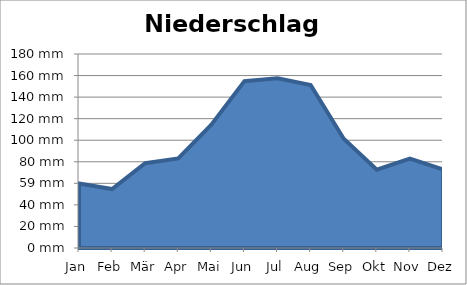
| Category | Niederschlag (mm) |
|---|---|
| Jan | 1900-02-28 21:36:00 |
| Feb | 1900-02-23 16:48:00 |
| Mär | 1900-03-18 16:48:00 |
| Apr | 1900-03-23 02:24:00 |
| Mai | 1900-04-23 12:00:00 |
| Jun | 1900-06-02 19:12:00 |
| Jul | 1900-06-05 12:00:00 |
| Aug | 1900-05-30 07:12:00 |
| Sep | 1900-04-10 07:12:00 |
| Okt | 1900-03-12 14:24:00 |
| Nov | 1900-03-23 |
| Dez | 1900-03-12 19:12:00 |